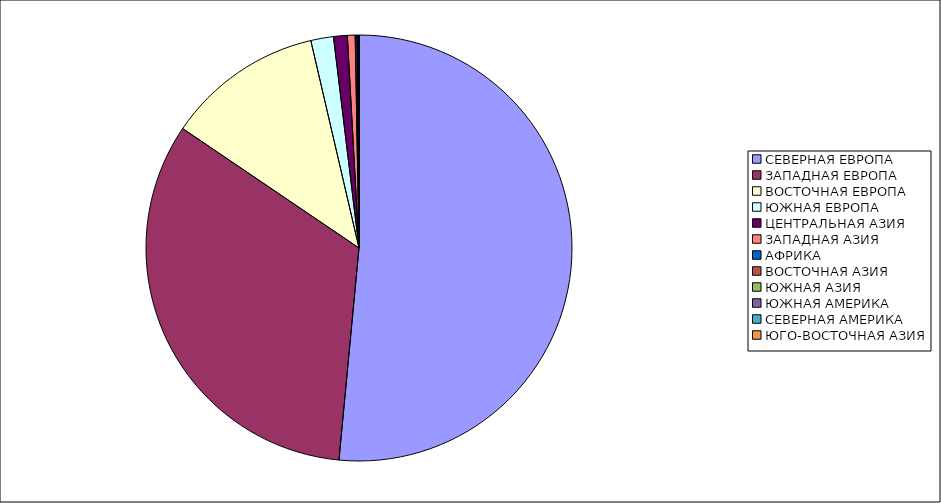
| Category | Оборот |
|---|---|
| СЕВЕРНАЯ ЕВРОПА | 51.499 |
| ЗАПАДНАЯ ЕВРОПА | 32.976 |
| ВОСТОЧНАЯ ЕВРОПА | 11.891 |
| ЮЖНАЯ ЕВРОПА | 1.717 |
| ЦЕНТРАЛЬНАЯ АЗИЯ | 1.044 |
| ЗАПАДНАЯ АЗИЯ | 0.587 |
| АФРИКА | 0.134 |
| ВОСТОЧНАЯ АЗИЯ | 0.062 |
| ЮЖНАЯ АЗИЯ | 0.048 |
| ЮЖНАЯ АМЕРИКА | 0.039 |
| СЕВЕРНАЯ АМЕРИКА | 0.002 |
| ЮГО-ВОСТОЧНАЯ АЗИЯ | 0 |